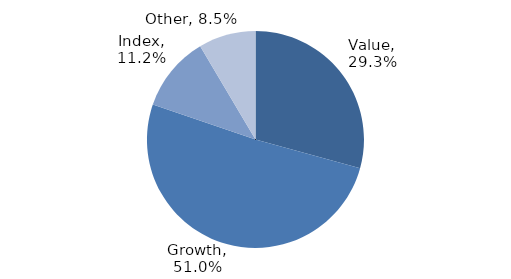
| Category | Investment Style |
|---|---|
| Value | 0.293 |
| Growth | 0.51 |
| Index | 0.112 |
| Other | 0.085 |